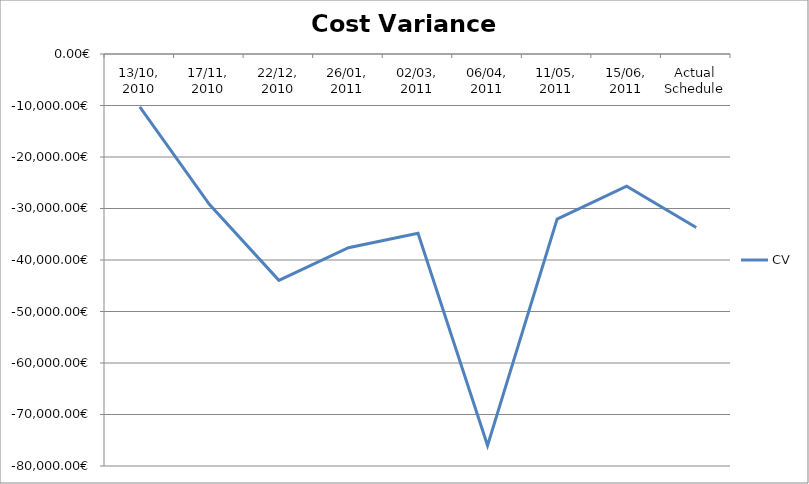
| Category | CV |
|---|---|
| 13/10, 2010 | -10286.537 |
| 17/11, 2010 | -29175.581 |
| 22/12, 2010 | -43958.585 |
| 26/01, 2011 | -37614.665 |
| 02/03, 2011 | -34788.764 |
| 06/04, 2011 | -76029.784 |
| 11/05, 2011 | -32060.227 |
| 15/06, 2011 | -25655.436 |
| Actual Schedule | -33704.206 |